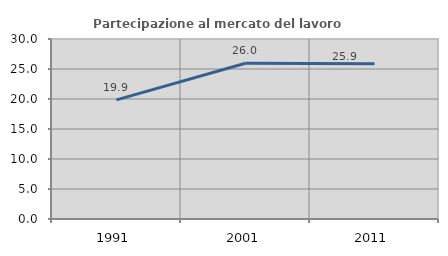
| Category | Partecipazione al mercato del lavoro  femminile |
|---|---|
| 1991.0 | 19.851 |
| 2001.0 | 25.959 |
| 2011.0 | 25.895 |